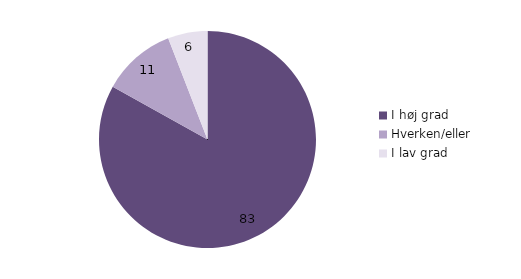
| Category | Series 0 |
|---|---|
| I høj grad | 83.1 |
| Hverken/eller  | 11 |
| I lav grad | 5.9 |